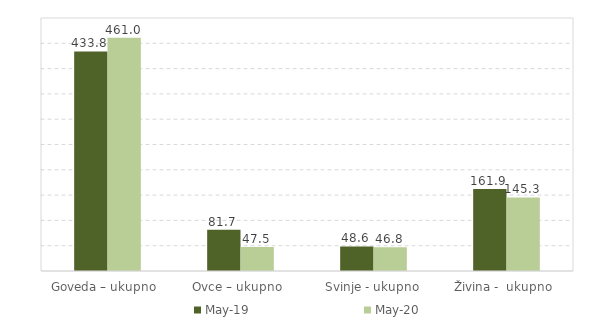
| Category | May-19 | May-20 |
|---|---|---|
| Goveda – ukupno  | 433.8 | 461 |
| Ovce – ukupno  | 81.7 | 47.5 |
| Svinje - ukupno | 48.6 | 46.8 |
| Živina -  ukupno  | 161.9 | 145.3 |